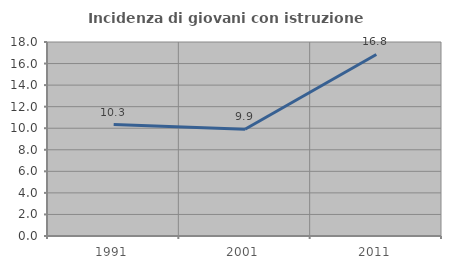
| Category | Incidenza di giovani con istruzione universitaria |
|---|---|
| 1991.0 | 10.345 |
| 2001.0 | 9.901 |
| 2011.0 | 16.842 |